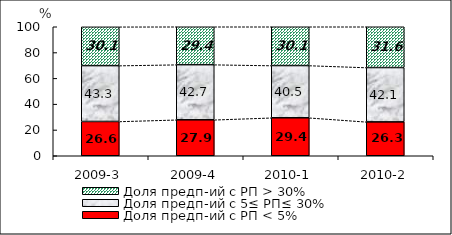
| Category | Доля предп-ий с РП < 5% | Доля предп-ий с 5≤ РП≤ 30% | Доля предп-ий с РП > 30% |
|---|---|---|---|
| 2009-3 | 26.58 | 43.3 | 30.07 |
| 2009-4 | 27.88 | 42.73 | 29.39 |
| 2010-1 | 29.44 | 40.49 | 30.07 |
| 2010-2 | 26.26 | 42.12 | 31.62 |